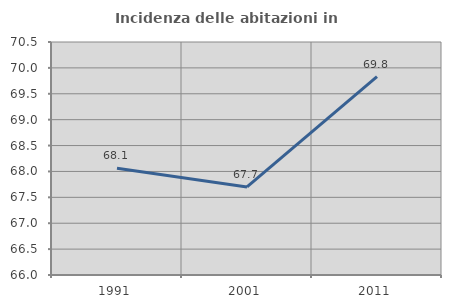
| Category | Incidenza delle abitazioni in proprietà  |
|---|---|
| 1991.0 | 68.061 |
| 2001.0 | 67.701 |
| 2011.0 | 69.833 |